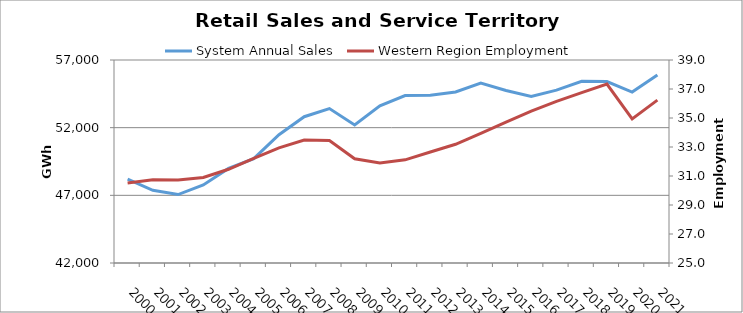
| Category | System Annual Sales |
|---|---|
| 2000.0 | 48203.483 |
| 2001.0 | 47374.489 |
| 2002.0 | 47057.066 |
| 2003.0 | 47771.259 |
| 2004.0 | 48987.8 |
| 2005.0 | 49713.446 |
| 2006.0 | 51474.907 |
| 2007.0 | 52808.062 |
| 2008.0 | 53409.183 |
| 2009.0 | 52197.714 |
| 2010.0 | 53612.44 |
| 2011.0 | 54376.107 |
| 2012.0 | 54402.334 |
| 2013.0 | 54641.961 |
| 2014.0 | 55289.702 |
| 2015.0 | 54742.851 |
| 2016.0 | 54303.991 |
| 2017.0 | 54771.525 |
| 2018.0 | 55425.488 |
| 2019.0 | 55406.143 |
| 2020.0 | 54628.18 |
| 2021.0 | 55896.227 |